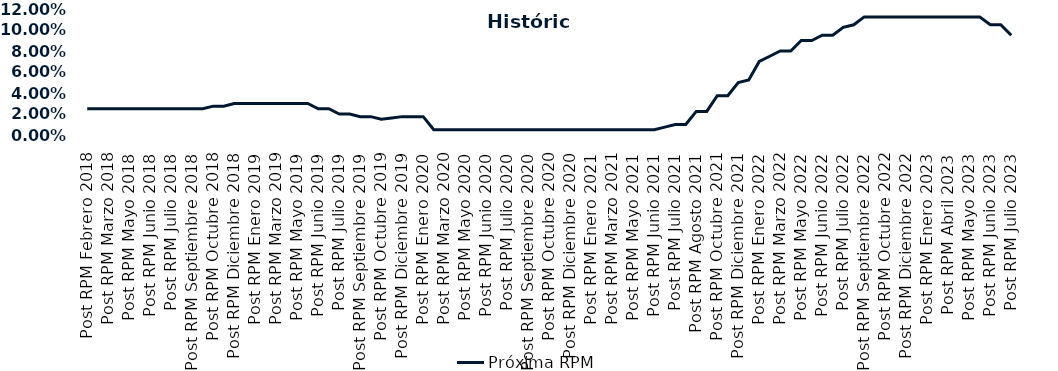
| Category | Próxima RPM |
|---|---|
| Post RPM Febrero 2018 | 0.025 |
| Pre RPM Marzo 2018 | 0.025 |
| Post RPM Marzo 2018 | 0.025 |
| Pre RPM Mayo 2018 | 0.025 |
| Post RPM Mayo 2018 | 0.025 |
| Pre RPM Junio 2018 | 0.025 |
| Post RPM Junio 2018 | 0.025 |
| Pre RPM Julio 2018 | 0.025 |
| Post RPM Julio 2018 | 0.025 |
| Pre RPM Septiembre 2018 | 0.025 |
| Post RPM Septiembre 2018 | 0.025 |
| Pre RPM Octubre 2018 | 0.025 |
| Post RPM Octubre 2018 | 0.028 |
| Pre RPM Diciembre 2018 | 0.028 |
| Post RPM Diciembre 2018 | 0.03 |
| Pre RPM Enero 2019 | 0.03 |
| Post RPM Enero 2019 | 0.03 |
| Pre RPM Marzo 2019 | 0.03 |
| Post RPM Marzo 2019 | 0.03 |
| Pre RPM Mayo 2019 | 0.03 |
| Post RPM Mayo 2019 | 0.03 |
| Pre RPM Junio 2019 | 0.03 |
| Post RPM Junio 2019 | 0.025 |
| Pre RPM Julio 2019 | 0.025 |
| Post RPM Julio 2019 | 0.02 |
| Pre RPM Septiembre 2019 | 0.02 |
| Post RPM Septiembre 2019 | 0.018 |
| Pre RPM Octubre 2019 | 0.018 |
| Post RPM Octubre 2019 | 0.015 |
| Pre RPM Diciembre 2019 | 0.016 |
| Post RPM Diciembre 2019 | 0.018 |
| Pre RPM Enero 2020 | 0.018 |
| Post RPM Enero 2020 | 0.018 |
| Pre RPM Marzo 2020 | 0.005 |
| Post RPM Marzo 2020 | 0.005 |
| Pre RPM Mayo 2020 | 0.005 |
| Post RPM Mayo 2020 | 0.005 |
| Pre RPM Junio 2020 | 0.005 |
| Post RPM Junio 2020 | 0.005 |
| Pre RPM Julio 2020 | 0.005 |
| Post RPM Julio 2020 | 0.005 |
| Pre RPM Septiembre 2020 | 0.005 |
| Post RPM Septiembre 2020 | 0.005 |
| Pre RPM Octubre 2020 | 0.005 |
| Post RPM Octubre 2020 | 0.005 |
| Pre RPM Diciembre 2020 | 0.005 |
| Post RPM Diciembre 2020 | 0.005 |
| Pre RPM Enero 2021 | 0.005 |
| Post RPM Enero 2021 | 0.005 |
| Pre RPM Marzo 2021 | 0.005 |
| Post RPM Marzo 2021 | 0.005 |
| Pre RPM Mayo 2021 | 0.005 |
| Post RPM Mayo 2021 | 0.005 |
| Pre RPM Junio 2021 | 0.005 |
| Post RPM Junio 2021 | 0.005 |
| Pre RPM Julio 2021 | 0.008 |
| Post RPM Julio 2021 | 0.01 |
| Pre RPM Agosto 2021 | 0.01 |
| Post RPM Agosto 2021 | 0.022 |
| Pre RPM Octubre 2021 | 0.022 |
| Post RPM Octubre 2021 | 0.038 |
| Pre RPM Diciembre 2021 | 0.038 |
| Post RPM Diciembre 2021 | 0.05 |
| Pre RPM Enero 2022 | 0.052 |
| Post RPM Enero 2022 | 0.07 |
| Pre RPM Marzo 2022 | 0.075 |
| Post RPM Marzo 2022 | 0.08 |
| Pre RPM Mayo 2022 | 0.08 |
| Post RPM Mayo 2022 | 0.09 |
| Pre RPM Junio 2022 | 0.09 |
| Post RPM Junio 2022 | 0.095 |
| Pre RPM Julio 2022 | 0.095 |
| Post RPM Julio 2022 | 0.102 |
| Pre RPM Septiembre 2022 | 0.105 |
| Post RPM Septiembre 2022 | 0.112 |
| Pre RPM Octubre 2022 | 0.112 |
| Post RPM Octubre 2022 | 0.112 |
| Pre RPM Diciembre 2022 | 0.112 |
| Post RPM Diciembre 2022 | 0.112 |
| Pre RPM Enero 2023 | 0.112 |
| Post RPM Enero 2023 | 0.112 |
| Pre RPM Abril 2023 | 0.112 |
| Post RPM Abril 2023 | 0.112 |
| Pre RPM Mayo 2023 | 0.112 |
| Post RPM Mayo 2023 | 0.112 |
| Pre RPM Junio 2023 | 0.112 |
| Post RPM Junio 2023 | 0.105 |
| Pre RPM Julio 2023 | 0.105 |
| Post RPM Julio 2023 | 0.095 |